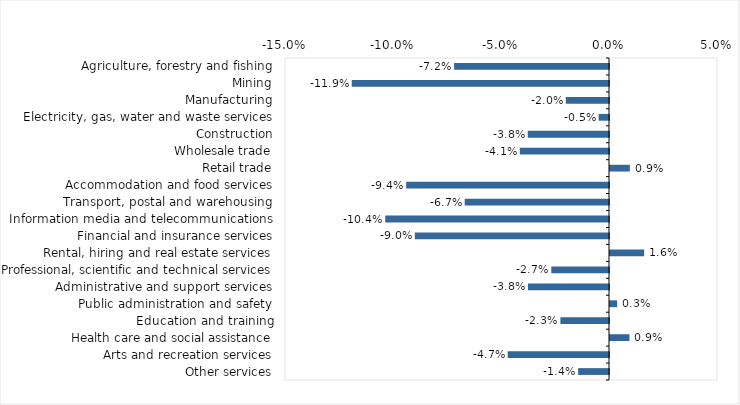
| Category | This week |
|---|---|
| Agriculture, forestry and fishing | -0.072 |
| Mining | -0.119 |
| Manufacturing | -0.02 |
| Electricity, gas, water and waste services | -0.005 |
| Construction | -0.038 |
| Wholesale trade | -0.041 |
| Retail trade | 0.009 |
| Accommodation and food services | -0.094 |
| Transport, postal and warehousing | -0.067 |
| Information media and telecommunications | -0.104 |
| Financial and insurance services | -0.09 |
| Rental, hiring and real estate services | 0.016 |
| Professional, scientific and technical services | -0.027 |
| Administrative and support services | -0.038 |
| Public administration and safety | 0.003 |
| Education and training | -0.022 |
| Health care and social assistance | 0.009 |
| Arts and recreation services | -0.047 |
| Other services | -0.014 |